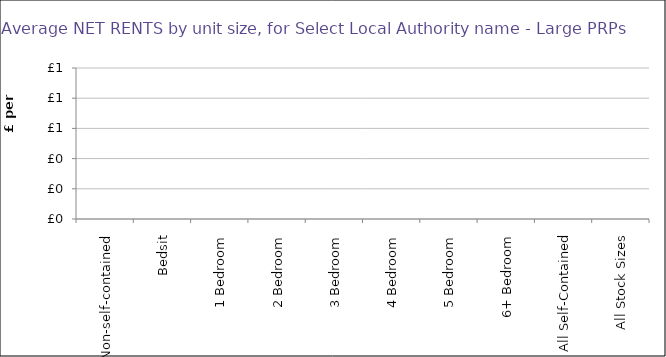
| Category | Net |
|---|---|
| Non-self-contained | 0 |
| Bedsit | 0 |
| 1 Bedroom | 0 |
| 2 Bedroom | 0 |
| 3 Bedroom | 0 |
| 4 Bedroom | 0 |
| 5 Bedroom | 0 |
| 6+ Bedroom | 0 |
| All Self-Contained | 0 |
| All Stock Sizes | 0 |